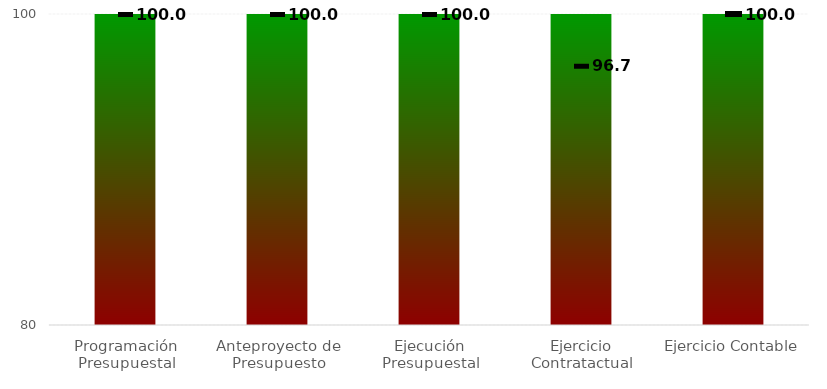
| Category | Niveles |
|---|---|
| Programación Presupuestal | 100 |
| Anteproyecto de Presupuesto | 100 |
| Ejecución Presupuestal | 100 |
| Ejercicio Contratactual | 100 |
| Ejercicio Contable | 100 |